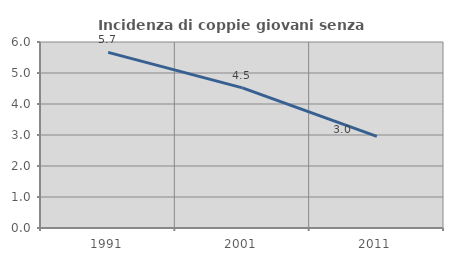
| Category | Incidenza di coppie giovani senza figli |
|---|---|
| 1991.0 | 5.665 |
| 2001.0 | 4.519 |
| 2011.0 | 2.956 |